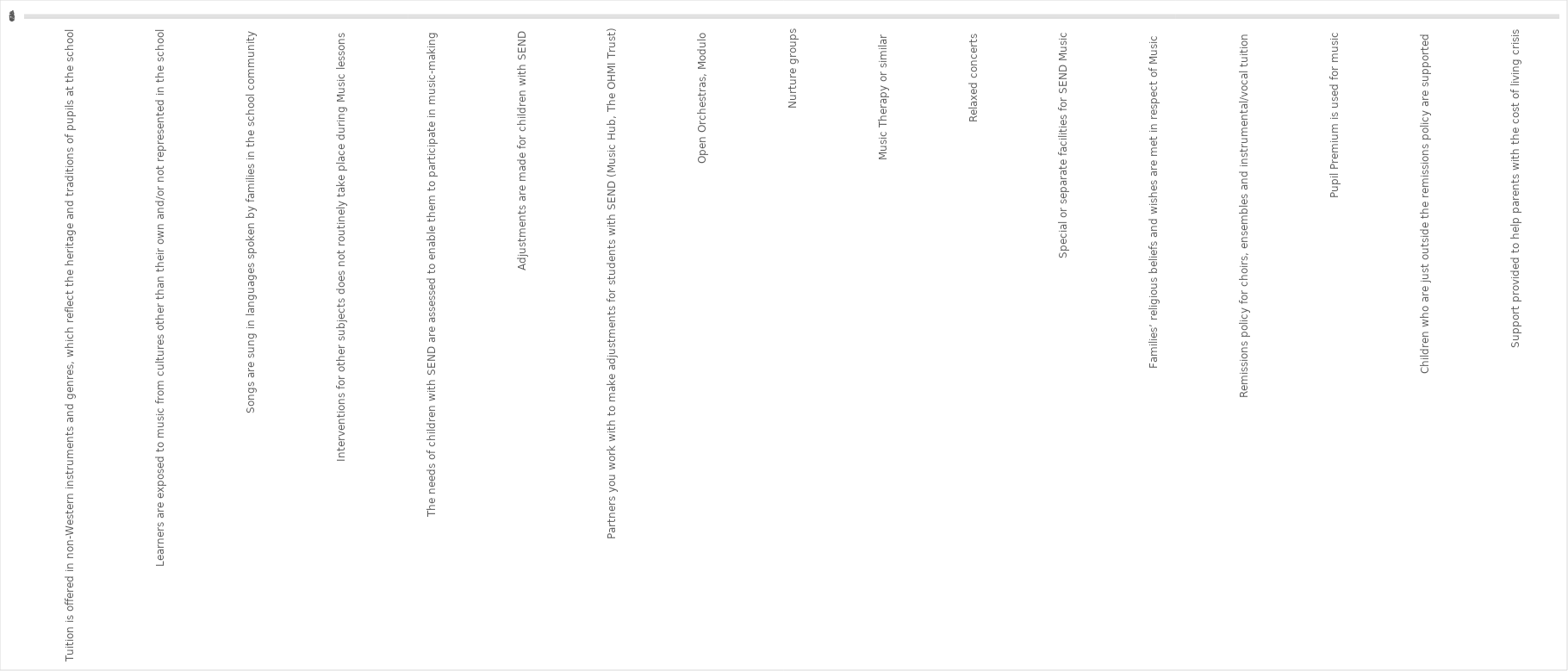
| Category | Series 0 |
|---|---|
| Tuition is offered in non-Western instruments and genres, which reflect the heritage and traditions of pupils at the school  | 0 |
| Learners are exposed to music from cultures other than their own and/or not represented in the school  | 0 |
| Songs are sung in languages spoken by families in the school community  | 0 |
| Interventions for other subjects does not routinely take place during Music lessons  | 0 |
| The needs of children with SEND are assessed to enable them to participate in music-making  | 0 |
| Adjustments are made for children with SEND  | 0 |
| Partners you work with to make adjustments for students with SEND (Music Hub, The OHMI Trust)  | 0 |
| Open Orchestras, Modulo  | 0 |
| Nurture groups | 0 |
| Music Therapy or similar  | 0 |
| Relaxed concerts  | 0 |
| Special or separate facilities for SEND Music | 0 |
| Families’ religious beliefs and wishes are met in respect of Music  | 0 |
| Remissions policy for choirs, ensembles and instrumental/vocal tuition  | 0 |
| Pupil Premium is used for music  | 0 |
| Children who are just outside the remissions policy are supported  | 0 |
| Support provided to help parents with the cost of living crisis  | 0 |